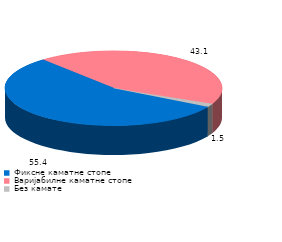
| Category | Series 0 |
|---|---|
| Фиксне каматне стопе | 55.4 |
| Варијабилне каматне стопе | 43.1 |
| Без камате | 1.5 |